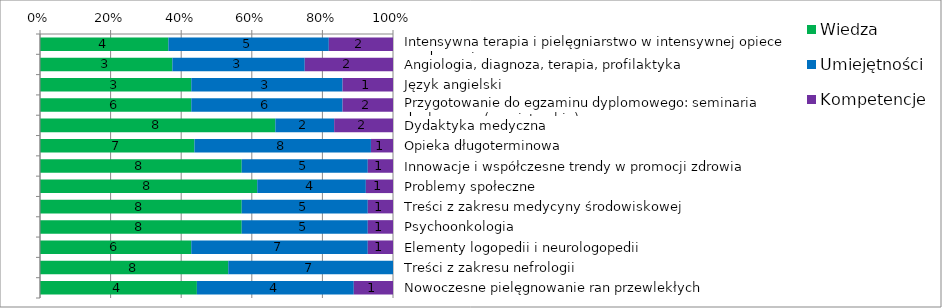
| Category | Wiedza | Umiejętności | Kompetencje |
|---|---|---|---|
| Intensywna terapia i pielęgniarstwo w intensywnej opiece medycznej | 4 | 5 | 2 |
| Angiologia, diagnoza, terapia, profilaktyka | 3 | 3 | 2 |
| Język angielski | 3 | 3 | 1 |
| Przygotowanie do egzaminu dyplomowego: seminaria dyplomowe (magisterskie) | 6 | 6 | 2 |
| Dydaktyka medyczna | 8 | 2 | 2 |
| Opieka długoterminowa | 7 | 8 | 1 |
| Innowacje i współczesne trendy w promocji zdrowia | 8 | 5 | 1 |
| Problemy społeczne | 8 | 4 | 1 |
| Treści z zakresu medycyny środowiskowej | 8 | 5 | 1 |
| Psychoonkologia | 8 | 5 | 1 |
| Elementy logopedii i neurologopedii | 6 | 7 | 1 |
| Treści z zakresu nefrologii | 8 | 7 | 0 |
| Nowoczesne pielęgnowanie ran przewlekłych | 4 | 4 | 1 |